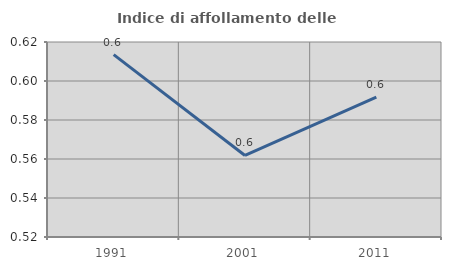
| Category | Indice di affollamento delle abitazioni  |
|---|---|
| 1991.0 | 0.613 |
| 2001.0 | 0.562 |
| 2011.0 | 0.592 |